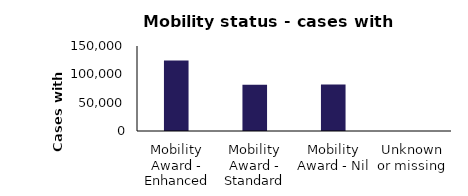
| Category | Series 0 |
|---|---|
| Mobility Award - Enhanced | 124471 |
| Mobility Award - Standard | 81786 |
| Mobility Award - Nil | 81859 |
| Unknown or missing | 17 |